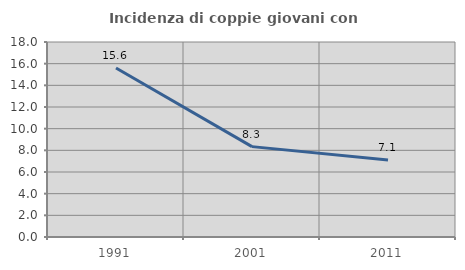
| Category | Incidenza di coppie giovani con figli |
|---|---|
| 1991.0 | 15.598 |
| 2001.0 | 8.343 |
| 2011.0 | 7.106 |